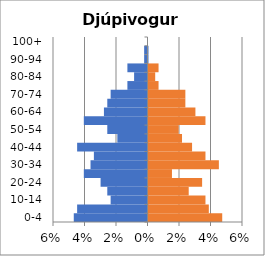
| Category | % Men | % Women |
|---|---|---|
| 0-4 | -0.047 | 0.047 |
| 5-9 | -0.045 | 0.038 |
| 10-14 | -0.023 | 0.036 |
| 15-19 | -0.026 | 0.026 |
| 20-24 | -0.03 | 0.034 |
| 25-29 | -0.04 | 0.015 |
| 30-34 | -0.036 | 0.045 |
| 35-39 | -0.034 | 0.036 |
| 40-44 | -0.045 | 0.028 |
| 45-49 | -0.019 | 0.021 |
| 50-54 | -0.026 | 0.019 |
| 55-59 | -0.04 | 0.036 |
| 60-64 | -0.028 | 0.03 |
| 65-69 | -0.026 | 0.023 |
| 70-74 | -0.023 | 0.023 |
| 75-79 | -0.013 | 0.006 |
| 80-84 | -0.009 | 0.004 |
| 85-89 | -0.013 | 0.006 |
| 90-94 | -0.002 | 0 |
| 95-99 | -0.002 | 0 |
| 100+ | 0 | 0 |